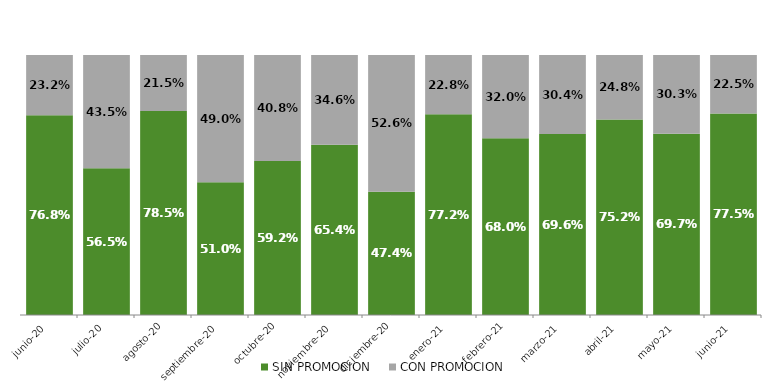
| Category | SIN PROMOCION   | CON PROMOCION   |
|---|---|---|
| 2020-06-01 | 0.768 | 0.232 |
| 2020-07-01 | 0.565 | 0.435 |
| 2020-08-01 | 0.785 | 0.215 |
| 2020-09-01 | 0.51 | 0.49 |
| 2020-10-01 | 0.592 | 0.408 |
| 2020-11-01 | 0.654 | 0.346 |
| 2020-12-01 | 0.474 | 0.526 |
| 2021-01-01 | 0.772 | 0.228 |
| 2021-02-01 | 0.68 | 0.32 |
| 2021-03-01 | 0.696 | 0.304 |
| 2021-04-01 | 0.752 | 0.248 |
| 2021-05-01 | 0.697 | 0.303 |
| 2021-06-01 | 0.775 | 0.225 |